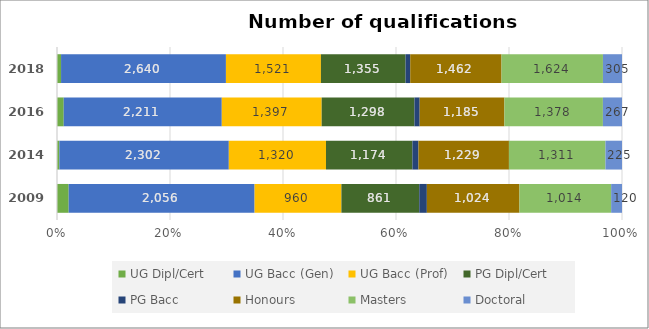
| Category | UG Dipl/Cert | UG Bacc (Gen) | UG Bacc (Prof) | PG Dipl/Cert | PG Bacc | Honours | Masters | Doctoral |
|---|---|---|---|---|---|---|---|---|
| 2009 | 129 | 2056 | 960 | 861 | 84 | 1024 | 1014 | 120 |
| 2014 | 32 | 2302 | 1320 | 1174 | 82 | 1229 | 1311 | 225 |
| 2016 | 94 | 2211 | 1397 | 1298 | 73 | 1185 | 1378 | 267 |
| 2018 | 65 | 2640 | 1521 | 1355 | 75 | 1462 | 1624 | 305 |